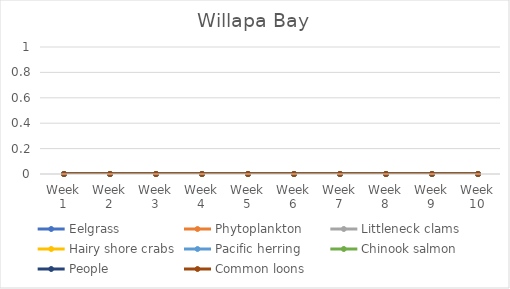
| Category | Eelgrass | Phytoplankton | Littleneck clams | Hairy shore crabs | Pacific herring | Chinook salmon | People | Common loons |
|---|---|---|---|---|---|---|---|---|
| Week 1 | 0 | 0 | 0 | 0 | 0 | 0 | 0 | 0 |
| Week 2 | 0 | 0 | 0 | 0 | 0 | 0 | 0 | 0 |
| Week 3 | 0 | 0 | 0 | 0 | 0 | 0 | 0 | 0 |
| Week 4 | 0 | 0 | 0 | 0 | 0 | 0 | 0 | 0 |
| Week 5 | 0 | 0 | 0 | 0 | 0 | 0 | 0 | 0 |
| Week 6 | 0 | 0 | 0 | 0 | 0 | 0 | 0 | 0 |
| Week 7 | 0 | 0 | 0 | 0 | 0 | 0 | 0 | 0 |
| Week 8 | 0 | 0 | 0 | 0 | 0 | 0 | 0 | 0 |
| Week 9 | 0 | 0 | 0 | 0 | 0 | 0 | 0 | 0 |
| Week 10 | 0 | 0 | 0 | 0 | 0 | 0 | 0 | 0 |